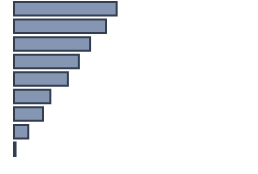
| Category | Percentatge |
|---|---|
| 0 | 42.771 |
| 1 | 38.337 |
| 2 | 31.706 |
| 3 | 27.027 |
| 4 | 22.45 |
| 5 | 15.138 |
| 6 | 12.111 |
| 7 | 5.977 |
| 8 | 0.645 |